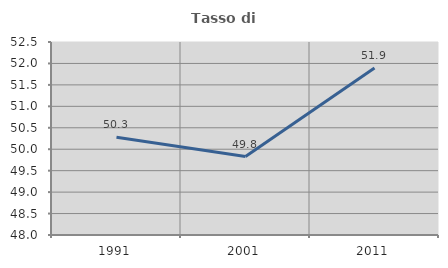
| Category | Tasso di occupazione   |
|---|---|
| 1991.0 | 50.277 |
| 2001.0 | 49.828 |
| 2011.0 | 51.895 |